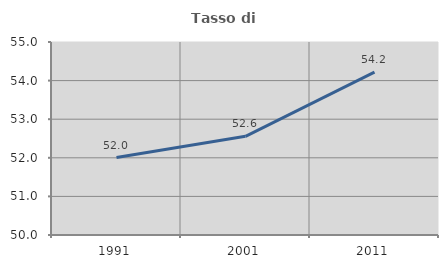
| Category | Tasso di occupazione   |
|---|---|
| 1991.0 | 52.007 |
| 2001.0 | 52.557 |
| 2011.0 | 54.218 |